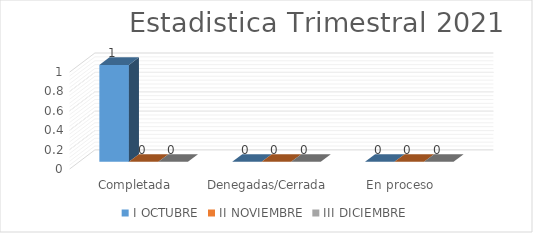
| Category | I | II | III |
|---|---|---|---|
| Completada | 1 | 0 | 0 |
| Denegadas/Cerrada | 0 | 0 | 0 |
| En proceso | 0 | 0 | 0 |